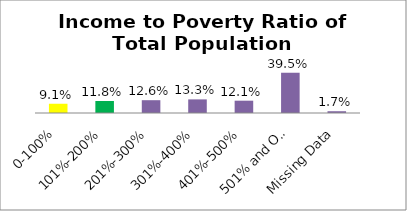
| Category | Percent |
|---|---|
| 0-100% | 0.091 |
| 101%-200% | 0.118 |
| 201%-300% | 0.126 |
| 301%-400% | 0.133 |
| 401%-500% | 0.121 |
| 501% and Over | 0.395 |
| Missing Data | 0.017 |